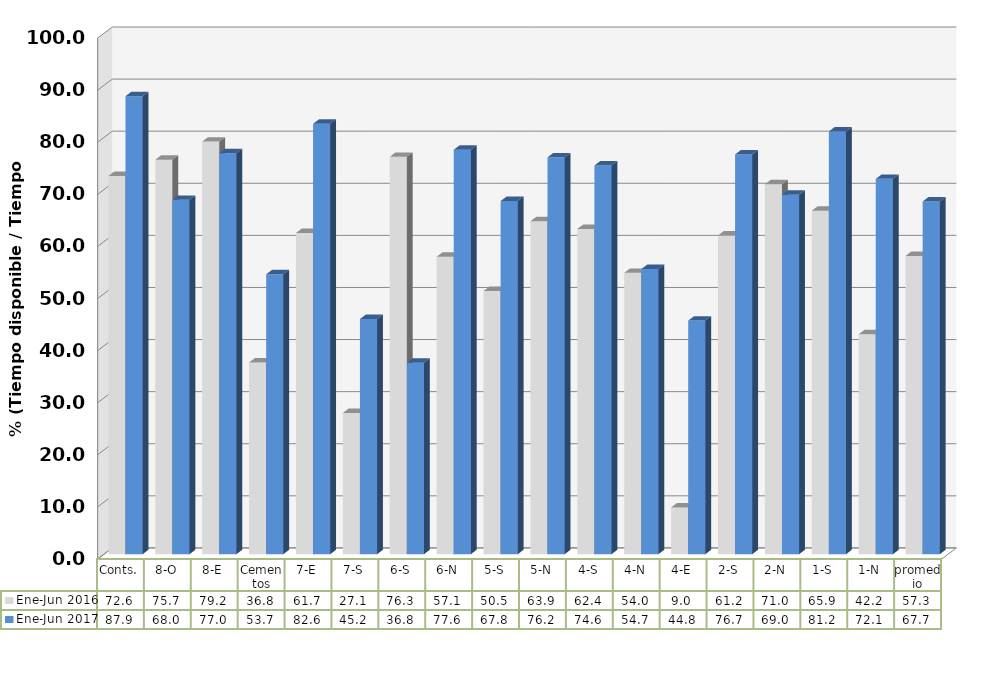
| Category | Ene-Jun 2016 | Ene-Jun 2017 |
|---|---|---|
| Conts. | 72.599 | 87.924 |
| 8-O | 75.729 | 68.033 |
| 8-E | 79.204 | 76.967 |
| Cementos | 36.803 | 53.737 |
| 7-E | 61.665 | 82.628 |
| 7-S | 27.12 | 45.157 |
| 6-S | 76.287 | 36.761 |
| 6-N | 57.103 | 77.645 |
| 5-S | 50.52 | 67.799 |
| 5-N | 63.925 | 76.188 |
| 4-S | 62.441 | 74.621 |
| 4-N | 54.019 | 54.745 |
| 4-E | 8.97 | 44.842 |
| 2-S | 61.191 | 76.745 |
| 2-N | 71.019 | 69.008 |
| 1-S | 65.935 | 81.165 |
| 1-N | 42.22 | 72.053 |
| promedio | 57.268 | 67.713 |